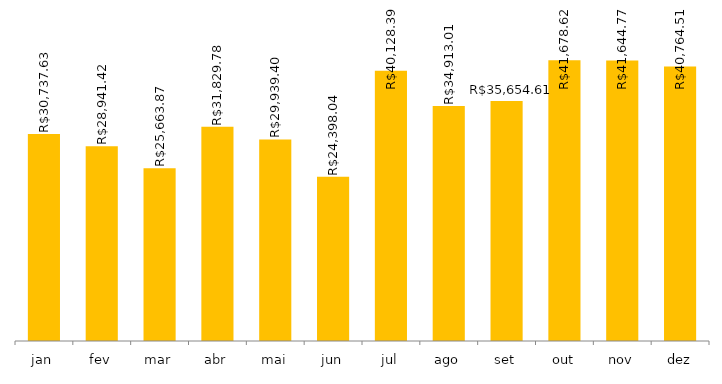
| Category | 2022 |
|---|---|
| jan | 30737.63 |
| fev | 28941.42 |
| mar | 25663.87 |
| abr | 31829.78 |
| mai | 29939.4 |
| jun | 24398.04 |
| jul | 40128.39 |
| ago | 34913.01 |
| set | 35654.61 |
| out | 41678.62 |
| nov | 41644.77 |
| dez | 40764.51 |